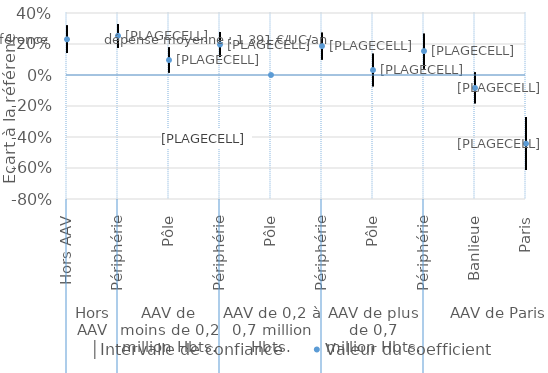
| Category | │Intervalle de confiance | Series 1 | Valeur du coefficient |
|---|---|---|---|
| 0 | 0.319 | 0.141 | 0.23 |
| 1 | 0.329 | 0.176 | 0.253 |
| 2 | 0.177 | 0.016 | 0.097 |
| 3 | 0.277 | 0.117 | 0.197 |
| 4 | 0 | 0 | 0 |
| 5 | 0.273 | 0.1 | 0.187 |
| 6 | 0.136 | -0.072 | 0.032 |
| 7 | 0.266 | 0.042 | 0.154 |
| 8 | 0.016 | -0.183 | -0.084 |
| 9 | -0.272 | -0.614 | -0.443 |